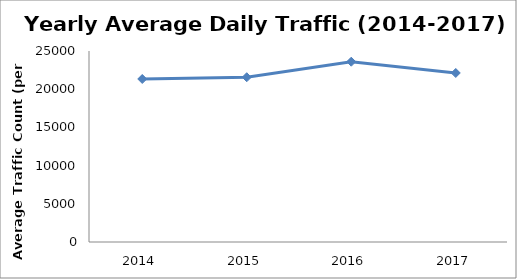
| Category | Series 0 |
|---|---|
| 2014.0 | 21335.34 |
| 2015.0 | 21565.523 |
| 2016.0 | 23598.637 |
| 2017.0 | 22121.526 |